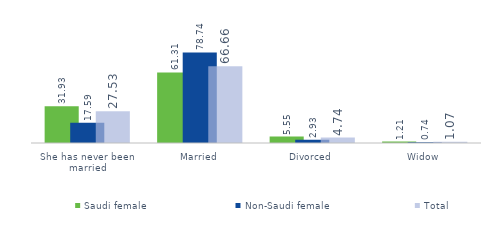
| Category | Saudi female  | Non-Saudi female | Total |
|---|---|---|---|
| She has never been married | 31.931 | 17.59 | 27.534 |
| Married | 61.314 | 78.74 | 66.658 |
| Divorced | 5.545 | 2.929 | 4.743 |
| Widow | 1.209 | 0.74 | 1.065 |